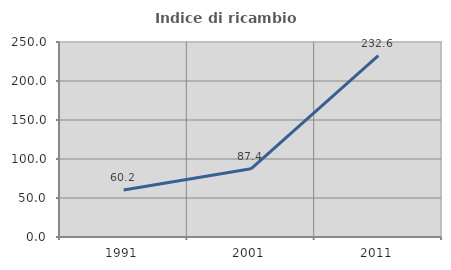
| Category | Indice di ricambio occupazionale  |
|---|---|
| 1991.0 | 60.201 |
| 2001.0 | 87.446 |
| 2011.0 | 232.609 |